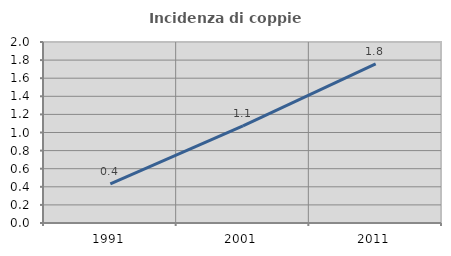
| Category | Incidenza di coppie miste |
|---|---|
| 1991.0 | 0.431 |
| 2001.0 | 1.072 |
| 2011.0 | 1.758 |